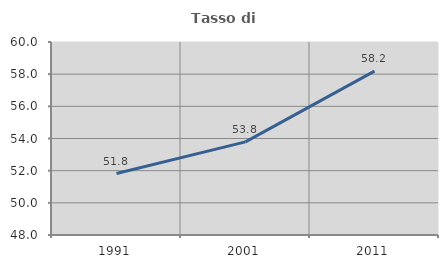
| Category | Tasso di occupazione   |
|---|---|
| 1991.0 | 51.821 |
| 2001.0 | 53.792 |
| 2011.0 | 58.193 |